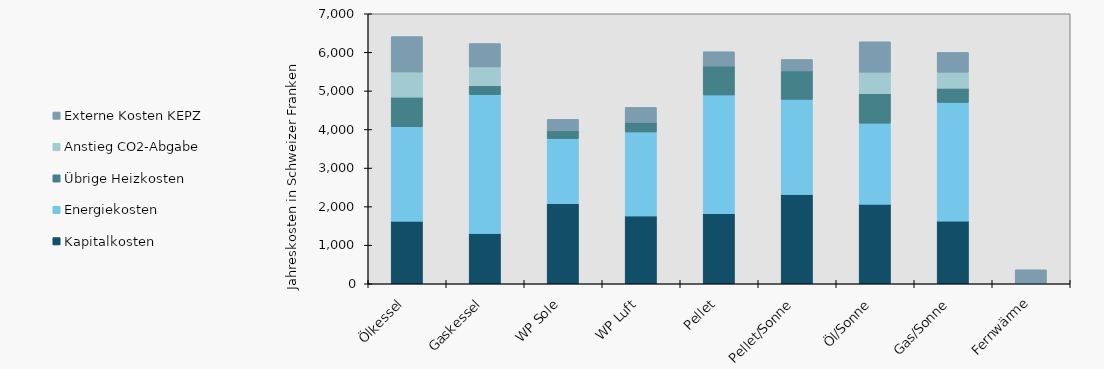
| Category | Kapitalkosten | Energiekosten | Übrige Heizkosten | Anstieg CO2-Abgabe | Externe Kosten KEPZ |
|---|---|---|---|---|---|
| Ölkessel | 1621.098 | 2448.485 | 768.97 | 652.276 | 918.182 |
| Gaskessel | 1303.525 | 3600 | 230 | 488.678 | 606 |
| WP Sole | 2073.432 | 1692.214 | 200 | 0 | 297.059 |
| WP Luft | 1759.276 | 2175.972 | 250 | 0 | 388.462 |
| Pellet | 1815.293 | 3079.268 | 751.585 | 0 | 369.512 |
| Pellet/Sonne | 2317.003 | 2463.415 | 739.268 | 0 | 295.61 |
| Öl/Sonne | 2061.078 | 2102.449 | 762.049 | 560.092 | 788.418 |
| Gas/Sonne | 1624.288 | 3078 | 367 | 415.377 | 515.1 |
| Fernwärme | 0 | 0 | 0 | 0 | 363.6 |